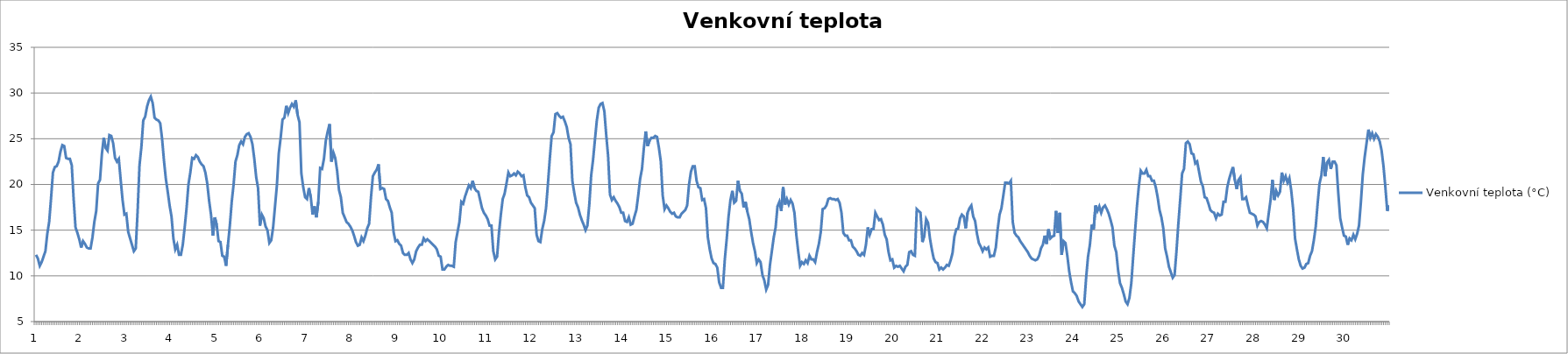
| Category | Venkovní teplota (°C) |
|---|---|
| 0 | 12.3 |
| 1 | 11.9 |
| 2 | 11.1 |
| 3 | 11.5 |
| 4 | 12.1 |
| 5 | 12.7 |
| 6 | 14.6 |
| 7 | 15.9 |
| 8 | 18.5 |
| 9 | 21.3 |
| 10 | 21.9 |
| 11 | 22 |
| 12 | 22.5 |
| 13 | 23.6 |
| 14 | 24.3 |
| 15 | 24.2 |
| 16 | 22.9 |
| 17 | 22.8 |
| 18 | 22.8 |
| 19 | 22.1 |
| 20 | 18.4 |
| 21 | 15.3 |
| 22 | 14.7 |
| 23 | 14 |
| 24 | 13.1 |
| 25 | 13.8 |
| 26 | 13.5 |
| 27 | 13.1 |
| 28 | 13 |
| 29 | 13 |
| 30 | 14.2 |
| 31 | 15.9 |
| 32 | 17.1 |
| 33 | 20.1 |
| 34 | 20.5 |
| 35 | 23.3 |
| 36 | 25.1 |
| 37 | 24 |
| 38 | 23.7 |
| 39 | 25.4 |
| 40 | 25.3 |
| 41 | 24.5 |
| 42 | 22.9 |
| 43 | 22.5 |
| 44 | 22.8 |
| 45 | 20.5 |
| 46 | 18.3 |
| 47 | 16.7 |
| 48 | 16.8 |
| 49 | 14.8 |
| 50 | 14.1 |
| 51 | 13.4 |
| 52 | 12.7 |
| 53 | 13 |
| 54 | 17.1 |
| 55 | 22.1 |
| 56 | 24.1 |
| 57 | 27 |
| 58 | 27.4 |
| 59 | 28.5 |
| 60 | 29.2 |
| 61 | 29.6 |
| 62 | 28.9 |
| 63 | 27.3 |
| 64 | 27.1 |
| 65 | 27 |
| 66 | 26.7 |
| 67 | 25 |
| 68 | 22.6 |
| 69 | 20.6 |
| 70 | 19.2 |
| 71 | 17.7 |
| 72 | 16.5 |
| 73 | 14.1 |
| 74 | 12.9 |
| 75 | 13.4 |
| 76 | 12.3 |
| 77 | 12.3 |
| 78 | 13.4 |
| 79 | 15.3 |
| 80 | 17.4 |
| 81 | 20 |
| 82 | 21.3 |
| 83 | 22.9 |
| 84 | 22.8 |
| 85 | 23.2 |
| 86 | 23 |
| 87 | 22.5 |
| 88 | 22.2 |
| 89 | 22 |
| 90 | 21.3 |
| 91 | 20.1 |
| 92 | 18.2 |
| 93 | 16.7 |
| 94 | 14.4 |
| 95 | 16.4 |
| 96 | 15.6 |
| 97 | 13.8 |
| 98 | 13.7 |
| 99 | 12.2 |
| 100 | 12.1 |
| 101 | 11.1 |
| 102 | 13.4 |
| 103 | 15.5 |
| 104 | 18.1 |
| 105 | 20 |
| 106 | 22.5 |
| 107 | 23.2 |
| 108 | 24.3 |
| 109 | 24.7 |
| 110 | 24.4 |
| 111 | 25.2 |
| 112 | 25.5 |
| 113 | 25.6 |
| 114 | 25.2 |
| 115 | 24.4 |
| 116 | 22.8 |
| 117 | 20.8 |
| 118 | 19.6 |
| 119 | 15.5 |
| 120 | 16.7 |
| 121 | 16.3 |
| 122 | 15.4 |
| 123 | 15 |
| 124 | 13.6 |
| 125 | 13.9 |
| 126 | 15.3 |
| 127 | 17.6 |
| 128 | 19.9 |
| 129 | 23.4 |
| 130 | 25.1 |
| 131 | 27.1 |
| 132 | 27.3 |
| 133 | 28.6 |
| 134 | 27.8 |
| 135 | 28.4 |
| 136 | 28.8 |
| 137 | 28.5 |
| 138 | 29.2 |
| 139 | 27.6 |
| 140 | 26.8 |
| 141 | 21.2 |
| 142 | 19.7 |
| 143 | 18.6 |
| 144 | 18.4 |
| 145 | 19.6 |
| 146 | 18.6 |
| 147 | 16.7 |
| 148 | 17.6 |
| 149 | 16.4 |
| 150 | 18.1 |
| 151 | 21.8 |
| 152 | 21.7 |
| 153 | 22.8 |
| 154 | 24.8 |
| 155 | 25.8 |
| 156 | 26.6 |
| 157 | 22.5 |
| 158 | 23.5 |
| 159 | 22.9 |
| 160 | 21.5 |
| 161 | 19.4 |
| 162 | 18.6 |
| 163 | 16.9 |
| 164 | 16.4 |
| 165 | 15.9 |
| 166 | 15.7 |
| 167 | 15.4 |
| 168 | 15 |
| 169 | 14.4 |
| 170 | 13.7 |
| 171 | 13.3 |
| 172 | 13.4 |
| 173 | 14.2 |
| 174 | 13.8 |
| 175 | 14.4 |
| 176 | 15.2 |
| 177 | 15.7 |
| 178 | 18.6 |
| 179 | 20.9 |
| 180 | 21.3 |
| 181 | 21.6 |
| 182 | 22.2 |
| 183 | 19.5 |
| 184 | 19.6 |
| 185 | 19.5 |
| 186 | 18.4 |
| 187 | 18.2 |
| 188 | 17.5 |
| 189 | 16.9 |
| 190 | 14.8 |
| 191 | 13.8 |
| 192 | 13.9 |
| 193 | 13.5 |
| 194 | 13.3 |
| 195 | 12.5 |
| 196 | 12.3 |
| 197 | 12.3 |
| 198 | 12.5 |
| 199 | 11.8 |
| 200 | 11.4 |
| 201 | 11.8 |
| 202 | 12.7 |
| 203 | 13.1 |
| 204 | 13.4 |
| 205 | 13.4 |
| 206 | 14.1 |
| 207 | 13.8 |
| 208 | 14 |
| 209 | 13.8 |
| 210 | 13.6 |
| 211 | 13.4 |
| 212 | 13.2 |
| 213 | 12.9 |
| 214 | 12.2 |
| 215 | 12.1 |
| 216 | 10.7 |
| 217 | 10.7 |
| 218 | 11 |
| 219 | 11.2 |
| 220 | 11.1 |
| 221 | 11.1 |
| 222 | 11 |
| 223 | 13.7 |
| 224 | 14.8 |
| 225 | 15.9 |
| 226 | 18.1 |
| 227 | 17.9 |
| 228 | 18.7 |
| 229 | 19.3 |
| 230 | 19.9 |
| 231 | 19.6 |
| 232 | 20.4 |
| 233 | 19.6 |
| 234 | 19.3 |
| 235 | 19.2 |
| 236 | 18.3 |
| 237 | 17.4 |
| 238 | 16.9 |
| 239 | 16.6 |
| 240 | 16.2 |
| 241 | 15.5 |
| 242 | 15.5 |
| 243 | 12.7 |
| 244 | 11.8 |
| 245 | 12.1 |
| 246 | 14.7 |
| 247 | 16.7 |
| 248 | 18.4 |
| 249 | 19 |
| 250 | 20.1 |
| 251 | 21.3 |
| 252 | 20.9 |
| 253 | 21 |
| 254 | 21.2 |
| 255 | 21 |
| 256 | 21.4 |
| 257 | 21.2 |
| 258 | 20.9 |
| 259 | 21 |
| 260 | 19.7 |
| 261 | 18.8 |
| 262 | 18.6 |
| 263 | 18 |
| 264 | 17.7 |
| 265 | 17.4 |
| 266 | 14.5 |
| 267 | 13.8 |
| 268 | 13.7 |
| 269 | 15.1 |
| 270 | 16 |
| 271 | 17.4 |
| 272 | 20 |
| 273 | 22.8 |
| 274 | 25.3 |
| 275 | 25.7 |
| 276 | 27.7 |
| 277 | 27.8 |
| 278 | 27.5 |
| 279 | 27.3 |
| 280 | 27.4 |
| 281 | 26.9 |
| 282 | 26.3 |
| 283 | 25.1 |
| 284 | 24.4 |
| 285 | 20.4 |
| 286 | 19.1 |
| 287 | 18 |
| 288 | 17.5 |
| 289 | 16.7 |
| 290 | 16.1 |
| 291 | 15.6 |
| 292 | 15 |
| 293 | 15.5 |
| 294 | 17.8 |
| 295 | 21 |
| 296 | 22.7 |
| 297 | 24.9 |
| 298 | 27 |
| 299 | 28.4 |
| 300 | 28.8 |
| 301 | 28.9 |
| 302 | 28 |
| 303 | 25.4 |
| 304 | 23.1 |
| 305 | 18.9 |
| 306 | 18.3 |
| 307 | 18.6 |
| 308 | 18.2 |
| 309 | 17.9 |
| 310 | 17.5 |
| 311 | 16.9 |
| 312 | 16.9 |
| 313 | 16 |
| 314 | 15.9 |
| 315 | 16.4 |
| 316 | 15.6 |
| 317 | 15.7 |
| 318 | 16.5 |
| 319 | 17.2 |
| 320 | 18.8 |
| 321 | 20.6 |
| 322 | 21.7 |
| 323 | 24 |
| 324 | 25.8 |
| 325 | 24.2 |
| 326 | 24.8 |
| 327 | 25.1 |
| 328 | 25.1 |
| 329 | 25.3 |
| 330 | 25.2 |
| 331 | 24 |
| 332 | 22.5 |
| 333 | 18.8 |
| 334 | 17.3 |
| 335 | 17.7 |
| 336 | 17.4 |
| 337 | 17 |
| 338 | 16.8 |
| 339 | 16.9 |
| 340 | 16.5 |
| 341 | 16.4 |
| 342 | 16.4 |
| 343 | 16.8 |
| 344 | 17 |
| 345 | 17.2 |
| 346 | 17.7 |
| 347 | 20 |
| 348 | 21.4 |
| 349 | 22 |
| 350 | 22 |
| 351 | 20.4 |
| 352 | 19.7 |
| 353 | 19.6 |
| 354 | 18.3 |
| 355 | 18.4 |
| 356 | 17.4 |
| 357 | 14.2 |
| 358 | 12.9 |
| 359 | 11.9 |
| 360 | 11.4 |
| 361 | 11.3 |
| 362 | 10.9 |
| 363 | 9.3 |
| 364 | 8.7 |
| 365 | 8.7 |
| 366 | 11.8 |
| 367 | 14 |
| 368 | 16.5 |
| 369 | 18.3 |
| 370 | 19.3 |
| 371 | 18 |
| 372 | 18.2 |
| 373 | 20.4 |
| 374 | 19.3 |
| 375 | 19 |
| 376 | 17.5 |
| 377 | 18.1 |
| 378 | 17 |
| 379 | 16.2 |
| 380 | 14.8 |
| 381 | 13.6 |
| 382 | 12.7 |
| 383 | 11.4 |
| 384 | 11.8 |
| 385 | 11.5 |
| 386 | 10.1 |
| 387 | 9.5 |
| 388 | 8.5 |
| 389 | 9 |
| 390 | 11.2 |
| 391 | 12.7 |
| 392 | 14.2 |
| 393 | 15.3 |
| 394 | 17.6 |
| 395 | 18.1 |
| 396 | 17.1 |
| 397 | 19.7 |
| 398 | 17.8 |
| 399 | 18.4 |
| 400 | 17.8 |
| 401 | 18.3 |
| 402 | 17.9 |
| 403 | 16.9 |
| 404 | 14.5 |
| 405 | 12.7 |
| 406 | 11.1 |
| 407 | 11.5 |
| 408 | 11.3 |
| 409 | 11.7 |
| 410 | 11.4 |
| 411 | 12.2 |
| 412 | 11.8 |
| 413 | 11.8 |
| 414 | 11.5 |
| 415 | 12.6 |
| 416 | 13.5 |
| 417 | 14.8 |
| 418 | 17.3 |
| 419 | 17.4 |
| 420 | 17.7 |
| 421 | 18.4 |
| 422 | 18.5 |
| 423 | 18.4 |
| 424 | 18.4 |
| 425 | 18.3 |
| 426 | 18.4 |
| 427 | 18 |
| 428 | 16.9 |
| 429 | 14.7 |
| 430 | 14.4 |
| 431 | 14.4 |
| 432 | 13.9 |
| 433 | 13.9 |
| 434 | 13.2 |
| 435 | 13 |
| 436 | 12.7 |
| 437 | 12.3 |
| 438 | 12.2 |
| 439 | 12.5 |
| 440 | 12.3 |
| 441 | 13.4 |
| 442 | 15.3 |
| 443 | 14.5 |
| 444 | 15.1 |
| 445 | 15.1 |
| 446 | 16.9 |
| 447 | 16.5 |
| 448 | 16.1 |
| 449 | 16.2 |
| 450 | 15.6 |
| 451 | 14.5 |
| 452 | 14 |
| 453 | 12.6 |
| 454 | 11.7 |
| 455 | 11.8 |
| 456 | 10.9 |
| 457 | 11.1 |
| 458 | 11 |
| 459 | 11.1 |
| 460 | 10.8 |
| 461 | 10.5 |
| 462 | 11 |
| 463 | 11.2 |
| 464 | 12.6 |
| 465 | 12.7 |
| 466 | 12.3 |
| 467 | 12.2 |
| 468 | 17.3 |
| 469 | 17.1 |
| 470 | 16.9 |
| 471 | 13.7 |
| 472 | 14.4 |
| 473 | 16.2 |
| 474 | 15.8 |
| 475 | 14.1 |
| 476 | 12.9 |
| 477 | 11.9 |
| 478 | 11.5 |
| 479 | 11.4 |
| 480 | 10.7 |
| 481 | 10.9 |
| 482 | 10.7 |
| 483 | 10.9 |
| 484 | 11.2 |
| 485 | 11.1 |
| 486 | 11.7 |
| 487 | 12.5 |
| 488 | 14.3 |
| 489 | 15.1 |
| 490 | 15.2 |
| 491 | 16.3 |
| 492 | 16.7 |
| 493 | 16.5 |
| 494 | 15.2 |
| 495 | 16.9 |
| 496 | 17.4 |
| 497 | 17.7 |
| 498 | 16.5 |
| 499 | 16 |
| 500 | 14.6 |
| 501 | 13.6 |
| 502 | 13.2 |
| 503 | 12.7 |
| 504 | 13.1 |
| 505 | 12.9 |
| 506 | 13.1 |
| 507 | 12.1 |
| 508 | 12.2 |
| 509 | 12.2 |
| 510 | 13.1 |
| 511 | 15.1 |
| 512 | 16.7 |
| 513 | 17.4 |
| 514 | 18.8 |
| 515 | 20.2 |
| 516 | 20.2 |
| 517 | 20.1 |
| 518 | 20.4 |
| 519 | 15.9 |
| 520 | 14.7 |
| 521 | 14.4 |
| 522 | 14.2 |
| 523 | 13.8 |
| 524 | 13.5 |
| 525 | 13.2 |
| 526 | 12.9 |
| 527 | 12.6 |
| 528 | 12.2 |
| 529 | 11.9 |
| 530 | 11.8 |
| 531 | 11.7 |
| 532 | 11.8 |
| 533 | 12.2 |
| 534 | 13 |
| 535 | 13.4 |
| 536 | 14.4 |
| 537 | 13.5 |
| 538 | 15.1 |
| 539 | 14.1 |
| 540 | 14.3 |
| 541 | 14.4 |
| 542 | 17.1 |
| 543 | 14.7 |
| 544 | 16.9 |
| 545 | 12.3 |
| 546 | 13.8 |
| 547 | 13.6 |
| 548 | 12.2 |
| 549 | 10.5 |
| 550 | 9.3 |
| 551 | 8.3 |
| 552 | 8.1 |
| 553 | 7.8 |
| 554 | 7.2 |
| 555 | 6.9 |
| 556 | 6.6 |
| 557 | 6.9 |
| 558 | 9.8 |
| 559 | 12.1 |
| 560 | 13.4 |
| 561 | 15.6 |
| 562 | 15.1 |
| 563 | 17.7 |
| 564 | 17.1 |
| 565 | 17.6 |
| 566 | 16.9 |
| 567 | 17.5 |
| 568 | 17.7 |
| 569 | 17.3 |
| 570 | 16.8 |
| 571 | 16.1 |
| 572 | 15.3 |
| 573 | 13.3 |
| 574 | 12.6 |
| 575 | 10.6 |
| 576 | 9.2 |
| 577 | 8.7 |
| 578 | 8 |
| 579 | 7.2 |
| 580 | 6.9 |
| 581 | 7.6 |
| 582 | 9.2 |
| 583 | 12.1 |
| 584 | 14.9 |
| 585 | 17.6 |
| 586 | 19.8 |
| 587 | 21.5 |
| 588 | 21.2 |
| 589 | 21.2 |
| 590 | 21.6 |
| 591 | 20.9 |
| 592 | 20.9 |
| 593 | 20.4 |
| 594 | 20.4 |
| 595 | 19.7 |
| 596 | 18.6 |
| 597 | 17.2 |
| 598 | 16.4 |
| 599 | 15.2 |
| 600 | 13 |
| 601 | 12.1 |
| 602 | 11 |
| 603 | 10.4 |
| 604 | 9.8 |
| 605 | 10.1 |
| 606 | 12.7 |
| 607 | 15.7 |
| 608 | 18.4 |
| 609 | 21.2 |
| 610 | 21.7 |
| 611 | 24.5 |
| 612 | 24.7 |
| 613 | 24.4 |
| 614 | 23.4 |
| 615 | 23.3 |
| 616 | 22.3 |
| 617 | 22.5 |
| 618 | 21.4 |
| 619 | 20.3 |
| 620 | 19.8 |
| 621 | 18.6 |
| 622 | 18.5 |
| 623 | 17.9 |
| 624 | 17.2 |
| 625 | 17 |
| 626 | 16.9 |
| 627 | 16.3 |
| 628 | 16.8 |
| 629 | 16.6 |
| 630 | 16.7 |
| 631 | 18.1 |
| 632 | 18.1 |
| 633 | 19.7 |
| 634 | 20.6 |
| 635 | 21.3 |
| 636 | 21.9 |
| 637 | 20.5 |
| 638 | 19.5 |
| 639 | 20.5 |
| 640 | 20.8 |
| 641 | 18.4 |
| 642 | 18.4 |
| 643 | 18.6 |
| 644 | 17.7 |
| 645 | 16.9 |
| 646 | 16.8 |
| 647 | 16.7 |
| 648 | 16.5 |
| 649 | 15.5 |
| 650 | 15.9 |
| 651 | 16 |
| 652 | 15.9 |
| 653 | 15.6 |
| 654 | 15.2 |
| 655 | 16.8 |
| 656 | 18.3 |
| 657 | 20.5 |
| 658 | 18.3 |
| 659 | 19.3 |
| 660 | 18.8 |
| 661 | 19.2 |
| 662 | 21.3 |
| 663 | 20.4 |
| 664 | 20.9 |
| 665 | 20.2 |
| 666 | 20.7 |
| 667 | 19.3 |
| 668 | 17.3 |
| 669 | 14.1 |
| 670 | 12.9 |
| 671 | 11.8 |
| 672 | 11.1 |
| 673 | 10.8 |
| 674 | 10.9 |
| 675 | 11.3 |
| 676 | 11.4 |
| 677 | 12.2 |
| 678 | 12.7 |
| 679 | 13.9 |
| 680 | 15.4 |
| 681 | 17.9 |
| 682 | 20.1 |
| 683 | 21 |
| 684 | 23 |
| 685 | 20.9 |
| 686 | 22.4 |
| 687 | 22.7 |
| 688 | 21.7 |
| 689 | 22.5 |
| 690 | 22.5 |
| 691 | 22.1 |
| 692 | 19 |
| 693 | 16.3 |
| 694 | 15.3 |
| 695 | 14.4 |
| 696 | 14.3 |
| 697 | 13.4 |
| 698 | 14.1 |
| 699 | 13.9 |
| 700 | 14.5 |
| 701 | 14 |
| 702 | 14.6 |
| 703 | 15.5 |
| 704 | 18.1 |
| 705 | 21.1 |
| 706 | 23 |
| 707 | 24.5 |
| 708 | 26 |
| 709 | 25.1 |
| 710 | 25.6 |
| 711 | 25 |
| 712 | 25.5 |
| 713 | 25.2 |
| 714 | 24.7 |
| 715 | 23.7 |
| 716 | 22 |
| 717 | 19.7 |
| 718 | 17.1 |
| 719 | 17.7 |